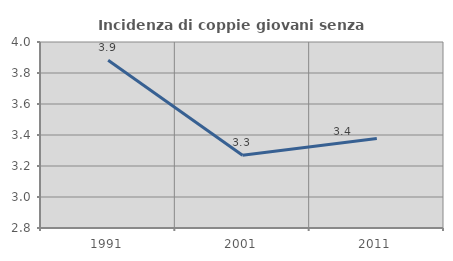
| Category | Incidenza di coppie giovani senza figli |
|---|---|
| 1991.0 | 3.882 |
| 2001.0 | 3.269 |
| 2011.0 | 3.377 |